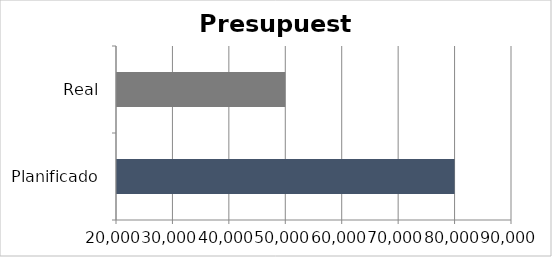
| Category | Series 0 |
|---|---|
| Planificado | 80000 |
| Real | 50000 |